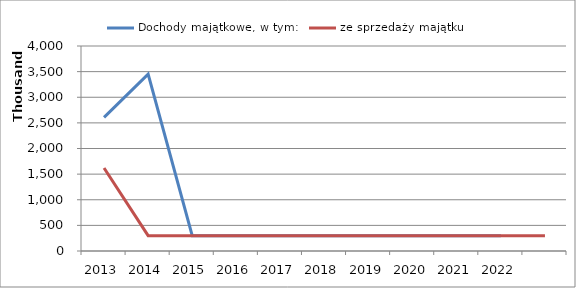
| Category | Dochody majątkowe, w tym: | ze sprzedaży majątku |
|---|---|---|
| 2013.0 | 2606760.25 | 1620000 |
| 2014.0 | 3450344 | 300000 |
| 2015.0 | 300000 | 300000 |
| 2016.0 | 300000 | 300000 |
| 2017.0 | 300000 | 300000 |
| 2018.0 | 300000 | 300000 |
| 2019.0 | 300000 | 300000 |
| 2020.0 | 300000 | 300000 |
| 2021.0 | 300000 | 300000 |
| 2022.0 | 300000 | 300000 |